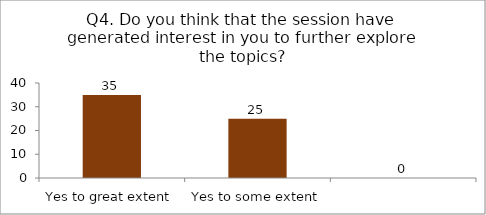
| Category | Q4. Do you think that the session have generated interest in you to further explore the topics? |
|---|---|
| Yes to great extent | 35 |
| Yes to some extent | 25 |